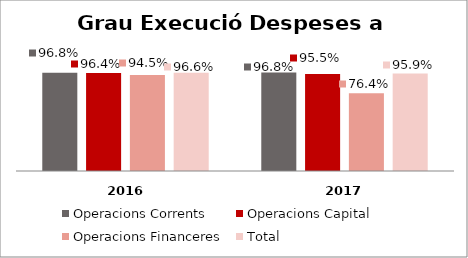
| Category | Operacions Corrents | Operacions Capital | Operacions Financeres | Total |
|---|---|---|---|---|
| 0 | 0.968 | 0.964 | 0.945 | 0.966 |
| 1 | 0.968 | 0.955 | 0.764 | 0.959 |